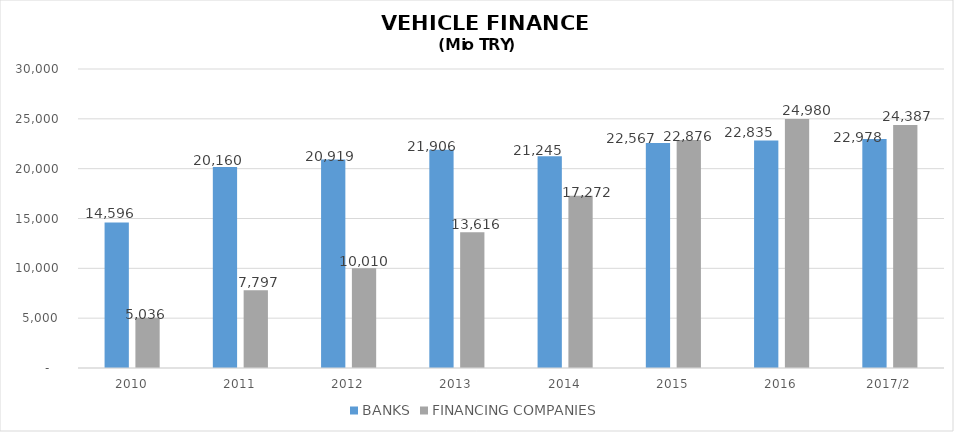
| Category | BANKS | FINANCING COMPANIES |
|---|---|---|
| 2010 | 14596 | 5035.89 |
| 2011 | 20160 | 7796.854 |
| 2012 | 20919 | 10009.755 |
| 2013 | 21906 | 13616.036 |
| 2014 | 21245 | 17271.844 |
| 2015 | 22567 | 22875.563 |
| 2016 | 22835 | 24980.231 |
| 2017/2 | 22978 | 24387.461 |